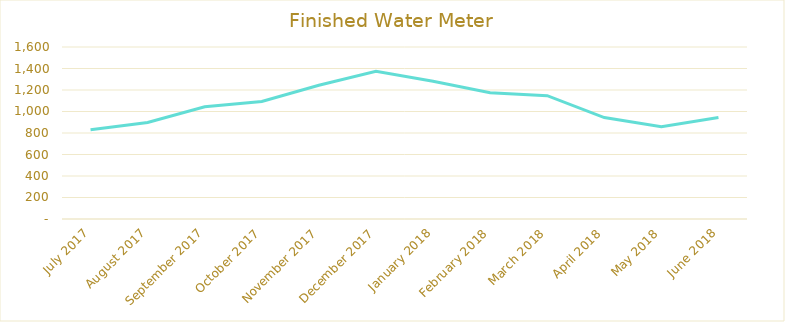
| Category | Series 0 |
|---|---|
| 2017-07-01 | 830.859 |
| 2017-08-01 | 897.135 |
| 2017-09-01 | 1043.538 |
| 2017-10-01 | 1093.556 |
| 2017-11-01 | 1244.372 |
| 2017-12-01 | 1373.169 |
| 2018-01-01 | 1280.913 |
| 2018-02-01 | 1175.144 |
| 2018-03-01 | 1147.208 |
| 2018-04-01 | 943.5 |
| 2018-05-01 | 858.34 |
| 2018-06-01 | 943.222 |